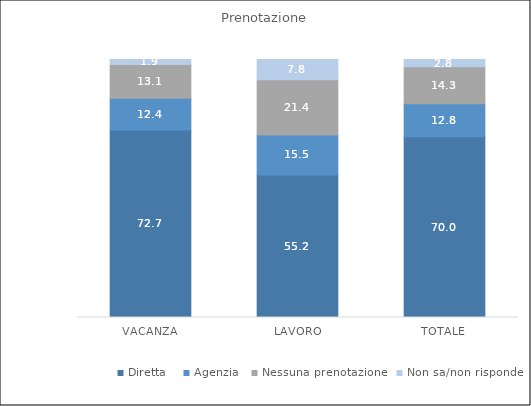
| Category | Diretta  | Agenzia | Nessuna prenotazione | Non sa/non risponde |
|---|---|---|---|---|
| VACANZA | 72.7 | 12.4 | 13.1 | 1.9 |
| LAVORO | 55.2 | 15.5 | 21.4 | 7.8 |
| TOTALE | 70 | 12.8 | 14.3 | 2.8 |